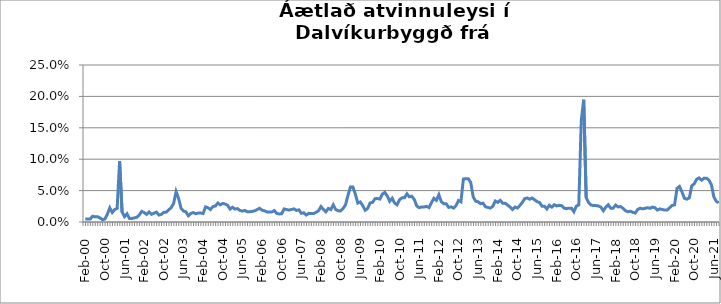
| Category | Series 0 |
|---|---|
| feb.00 | 0.005 |
| mar.00 | 0.005 |
| apr.00 | 0.005 |
| maí.00 | 0.009 |
| jún.00 | 0.008 |
| júl.00 | 0.008 |
| ágú.00 | 0.007 |
| sep.00 | 0.004 |
| okt.00 | 0.005 |
| nóv.00 | 0.012 |
| des.00 | 0.023 |
| jan.01 | 0.015 |
| feb.01 | 0.02 |
| mar.01 | 0.022 |
| apr.01 | 0.097 |
| maí.01 | 0.016 |
| jún.01 | 0.008 |
| júl.01 | 0.013 |
| ágú.01 | 0.006 |
| sep.01 | 0.006 |
| okt.01 | 0.007 |
| nóv.01 | 0.007 |
| des.01 | 0.011 |
| jan.02 | 0.017 |
| feb.02 | 0.015 |
| mar.02 | 0.012 |
| apr.02 | 0.016 |
| maí.02 | 0.012 |
| jún.02 | 0.014 |
| júl.02 | 0.016 |
| ágú.02 | 0.011 |
| sep.02 | 0.012 |
| okt.02 | 0.016 |
| nóv.02 | 0.016 |
| des.02 | 0.019 |
| jan.03 | 0.023 |
| feb.03 | 0.029 |
| mar.03 | 0.049 |
| apr.03 | 0.038 |
| maí.03 | 0.022 |
| jún.03 | 0.018 |
| júl.03 | 0.016 |
| ágú.03 | 0.01 |
| sep.03 | 0.013 |
| okt.03 | 0.015 |
| nóv.03 | 0.013 |
| des.03 | 0.014 |
| jan.04 | 0.014 |
| feb.04 | 0.013 |
| mar.04 | 0.024 |
| apr.04 | 0.023 |
| maí.04 | 0.02 |
| jún.04 | 0.025 |
| júl.04 | 0.025 |
| ágú.04 | 0.03 |
| sep.04 | 0.027 |
| okt.04 | 0.03 |
| nóv.04 | 0.029 |
| des.04 | 0.027 |
| jan.05 | 0.021 |
| feb.05 | 0.024 |
| mar.05 | 0.021 |
| apr.05 | 0.021 |
| maí.05 | 0.018 |
| jún.05 | 0.017 |
| júl.05 | 0.018 |
| ágú.05 | 0.016 |
| sep.05 | 0.016 |
| okt.05 | 0.017 |
| nóv.05 | 0.018 |
| des.05 | 0.02 |
| jan.06 | 0.022 |
| feb.06 | 0.019 |
| mar.06 | 0.018 |
| apr.06 | 0.016 |
| maí.06 | 0.016 |
| jún.06 | 0.016 |
| júl.06 | 0.018 |
| ágú.06 | 0.014 |
| sep.06 | 0.013 |
| okt.06 | 0.013 |
| nóv.06 | 0.021 |
| des.06 | 0.02 |
| jan.07 | 0.019 |
| feb.07 | 0.02 |
| mar.07 | 0.021 |
| apr.07 | 0.018 |
| maí.07 | 0.019 |
| jún.07 | 0.014 |
| júl.07 | 0.015 |
| ágú.07 | 0.011 |
| sep.07 | 0.014 |
| okt.07 | 0.013 |
| nóv.07 | 0.013 |
| des.07 | 0.015 |
| jan.08 | 0.018 |
| feb.08 | 0.025 |
| mar.08 | 0.02 |
| apr.08 | 0.016 |
| maí.08 | 0.022 |
| jún.08 | 0.02 |
| júl.08 | 0.027 |
| ágú.08 | 0.02 |
| sep.08 | 0.018 |
| okt.08 | 0.018 |
| nóv.08 | 0.022 |
| des.08 | 0.027 |
| jan.09 | 0.043 |
| feb.09 | 0.056 |
| mar.09 | 0.056 |
| apr.09 | 0.044 |
| maí.09 | 0.03 |
| jún.09 | 0.032 |
| júl.09 | 0.026 |
| ágú.09 | 0.019 |
| sep.09 | 0.022 |
| okt.09 | 0.03 |
| nóv.09 | 0.031 |
| des.09 | 0.037 |
| jan.10 | 0.038 |
| feb.10 | 0.037 |
| mar.10 | 0.044 |
| apr.10 | 0.047 |
| maí.10 | 0.041 |
| jún.10 | 0.033 |
| júl.10 | 0.038 |
| ágú.10 | 0.03 |
| sep.10 | 0.027 |
| okt.10 | 0.036 |
| nóv.10 | 0.038 |
| des.10 | 0.038 |
| jan.11 | 0.045 |
| feb.11 | 0.04 |
| mar.11 | 0.041 |
| apr.11 | 0.036 |
| maí.11 | 0.026 |
| jún.11 | 0.023 |
| júl.11 | 0.024 |
| ágú.11 | 0.024 |
| sep.11 | 0.025 |
| okt.11 | 0.023 |
| nóv.11 | 0.031 |
| des.11 | 0.038 |
| jan.12 | 0.034 |
| feb.12 | 0.044 |
| mar.12 | 0.032 |
| apr.12 | 0.029 |
| maí.12 | 0.029 |
| jún.12 | 0.023 |
| júl.12 | 0.024 |
| ágú.12 | 0.022 |
| sep.12 | 0.026 |
| okt.12 | 0.034 |
| nóv.12 | 0.032 |
| des.12 | 0.068 |
| jan.13 | 0.069 |
| feb.13 | 0.069 |
| mar.13 | 0.063 |
| apr.13 | 0.04 |
| maí.13 | 0.033 |
| jún.13 | 0.032 |
| júl.13 | 0.029 |
| ágú.13 | 0.03 |
| sep.13 | 0.024 |
| okt.13 | 0.023 |
| nóv.13 | 0.022 |
| des.13 | 0.025 |
| jan.14 | 0.033 |
| feb.14 | 0.031 |
| mar.14 | 0.034 |
| apr.14 | 0.03 |
| maí.14 | 0.03 |
| jún.14 | 0.027 |
| júl.14 | 0.024 |
| ágú.14 | 0.02 |
| sep.14 | 0.024 |
| okt.14 | 0.022 |
| nóv.14 | 0.026 |
| des.14 | 0.031 |
| jan.15 | 0.037 |
| feb.15 | 0.038 |
| mar.15 | 0.036 |
| apr.15 | 0.038 |
| maí.15 | 0.035 |
| jún.15 | 0.032 |
| júl.15 | 0.031 |
| ágú.15 | 0.025 |
| sep.15 | 0.025 |
| okt.15 | 0.021 |
| nóv.15 | 0.027 |
| des.15 | 0.024 |
| jan.16 | 0.028 |
| feb.16 | 0.026 |
| mar.16 | 0.027 |
| apr.16 | 0.026 |
| maí.16 | 0.022 |
| jún.16 | 0.021 |
| júl.16 | 0.022 |
| ágú.16 | 0.022 |
| sep.16 | 0.016 |
| okt.16 | 0.025 |
| nóv.16 | 0.027 |
| des.16 | 0.161 |
| jan.17 | 0.195 |
| feb.17 | 0.039 |
| mar.17 | 0.031 |
| apr.17 | 0.027 |
| maí.17 | 0.026 |
| jún.17 | 0.026 |
| júl.17 | 0.025 |
| ágú.17 | 0.024 |
| sep.17 | 0.018 |
| okt.17 | 0.024 |
| nóv.17 | 0.028 |
| des.17 | 0.022 |
| jan.18 | 0.022 |
| feb.18 | 0.027 |
| mar.18 | 0.024 |
| apr.18 | 0.025 |
| maí.18 | 0.022 |
| jún.18 | 0.018 |
| júl.18 | 0.016 |
| ágú.18 | 0.017 |
| sep.18 | 0.015 |
| okt.18 | 0.014 |
| nóv.18 | 0.02 |
| des.18 | 0.022 |
| jan.19 | 0.021 |
| feb.19 | 0.022 |
| mar.19 | 0.023 |
| apr.19 | 0.022 |
| maí.19 | 0.024 |
| jún.19 | 0.023 |
| júl.19 | 0.019 |
| ágú.19 | 0.021 |
| sep.19 | 0.02 |
| okt.19 | 0.019 |
| nóv.19 | 0.019 |
| des.19 | 0.023 |
| jan.20 | 0.026 |
| feb.20 | 0.027 |
| mar.2020* | 0.054 |
| apr.20 | 0.057 |
| maí.20 | 0.048 |
| jún.20 | 0.038 |
| júl.20 | 0.036 |
| ágú.20 | 0.038 |
| sep.20 | 0.058 |
| okt.20 | 0.061 |
| nóv.20 | 0.068 |
| des.20 | 0.07 |
| jan.21 | 0.067 |
| feb.21 | 0.07 |
| mar.21 | 0.07 |
| apr.21 | 0.067 |
| maí.21 | 0.059 |
| jún.21 | 0.04 |
| júl.21 | 0.033 |
| ágú.21 | 0.031 |